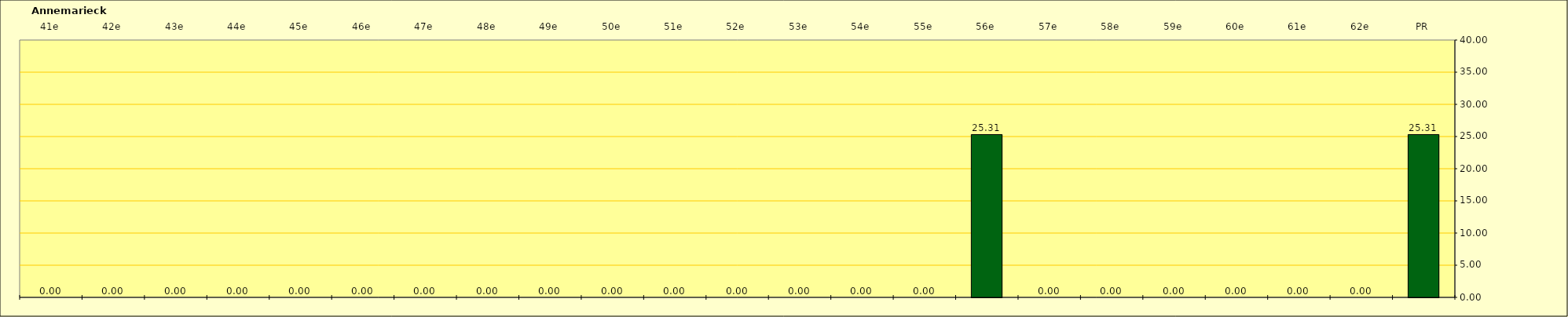
| Category | Annemariecke |
|---|---|
| PR | 25.31 |
| 62e | 0 |
| 61e | 0 |
| 60e | 0 |
| 59e | 0 |
| 58e | 0 |
| 57e | 0 |
| 56e | 25.31 |
| 55e | 0 |
| 54e | 0 |
| 53e | 0 |
| 52e | 0 |
| 51e | 0 |
| 50e | 0 |
| 49e | 0 |
| 48e | 0 |
| 47e | 0 |
| 46e | 0 |
| 45e | 0 |
| 44e | 0 |
| 43e | 0 |
| 42e | 0 |
| 41e | 0 |